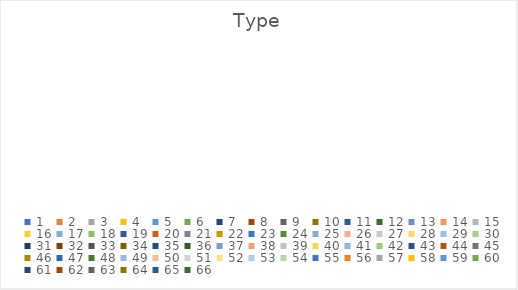
| Category | Type |
|---|---|
| 0 | 0 |
| 1 | 0 |
| 2 | 0 |
| 3 | 0 |
| 4 | 0 |
| 5 | 0 |
| 6 | 0 |
| 7 | 0 |
| 8 | 0 |
| 9 | 0 |
| 10 | 0 |
| 11 | 0 |
| 12 | 0 |
| 13 | 0 |
| 14 | 0 |
| 15 | 0 |
| 16 | 0 |
| 17 | 0 |
| 18 | 0 |
| 19 | 0 |
| 20 | 0 |
| 21 | 0 |
| 22 | 0 |
| 23 | 0 |
| 24 | 0 |
| 25 | 0 |
| 26 | 0 |
| 27 | 0 |
| 28 | 0 |
| 29 | 0 |
| 30 | 0 |
| 31 | 0 |
| 32 | 0 |
| 33 | 0 |
| 34 | 0 |
| 35 | 0 |
| 36 | 0 |
| 37 | 0 |
| 38 | 0 |
| 39 | 0 |
| 40 | 0 |
| 41 | 0 |
| 42 | 0 |
| 43 | 0 |
| 44 | 0 |
| 45 | 0 |
| 46 | 0 |
| 47 | 0 |
| 48 | 0 |
| 49 | 0 |
| 50 | 0 |
| 51 | 0 |
| 52 | 0 |
| 53 | 0 |
| 54 | 0 |
| 55 | 0 |
| 56 | 0 |
| 57 | 0 |
| 58 | 0 |
| 59 | 0 |
| 60 | 0 |
| 61 | 0 |
| 62 | 0 |
| 63 | 0 |
| 64 | 0 |
| 65 | 0 |